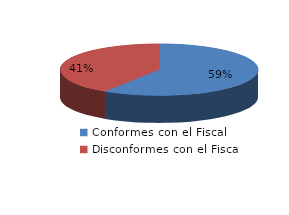
| Category | Series 0 |
|---|---|
| 0 | 1547 |
| 1 | 1070 |